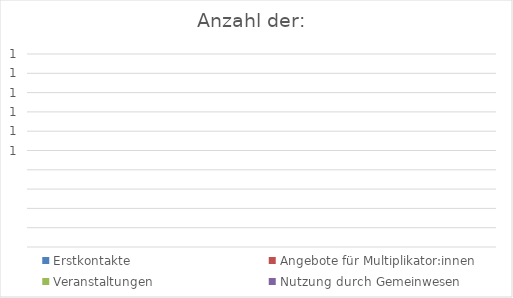
| Category | Erstkontakte | Angebote für Multiplikator:innen | Veranstaltungen | Nutzung durch Gemeinwesen |
|---|---|---|---|---|
| 0 | 0 | 0 | 0 | 0 |